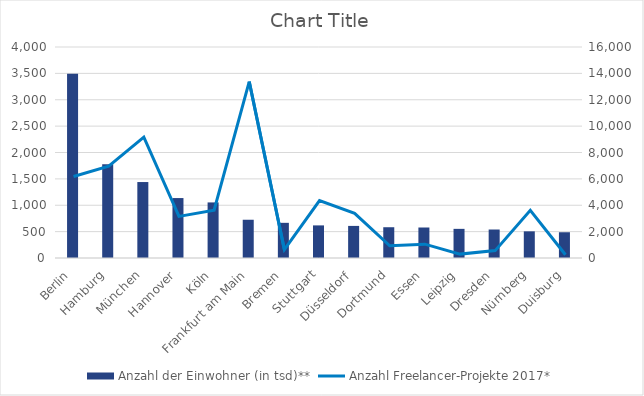
| Category | Anzahl der Einwohner (in tsd)** |
|---|---|
| Berlin | 3494.94 |
| Hamburg | 1775.1 |
| München | 1440 |
| Hannover | 1136.259 |
| Köln | 1053.631 |
| Frankfurt am Main | 725.156 |
| Bremen | 666.689 |
| Stuttgart | 618.1 |
| Düsseldorf | 608.353 |
| Dortmund | 583.346 |
| Essen | 578.204 |
| Leipzig | 552.5 |
| Dresden | 540.064 |
| Nürnberg | 505.5 |
| Duisburg | 488.348 |